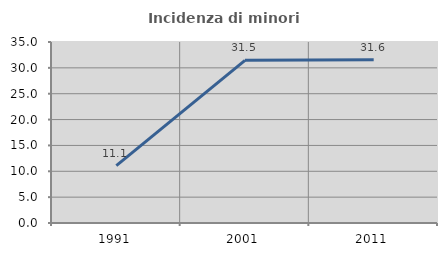
| Category | Incidenza di minori stranieri |
|---|---|
| 1991.0 | 11.111 |
| 2001.0 | 31.461 |
| 2011.0 | 31.579 |